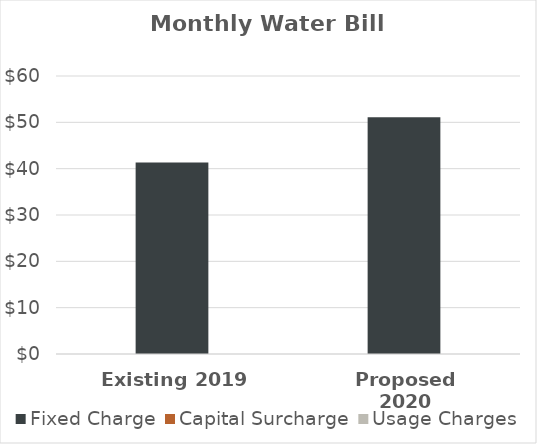
| Category | Fixed Charge | Capital Surcharge | Usage Charges | Taxes |
|---|---|---|---|---|
| Existing 2019 | 41.32 | 0 | 0 |  |
| Proposed 2020 | 51.12 | 0 | 0 |  |